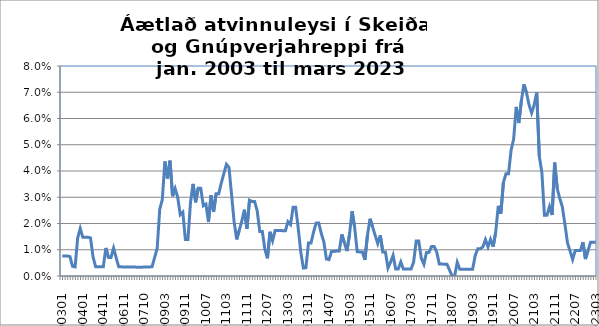
| Category | Series 0 |
|---|---|
| 200301 | 0.008 |
| 200302 | 0.008 |
| 200303 | 0.008 |
| 200304 | 0.007 |
| 200305 | 0.004 |
| 200308 | 0.003 |
| 200311 | 0.014 |
| 200312 | 0.018 |
| 200401 | 0.015 |
| 200402 | 0.015 |
| 200403 | 0.015 |
| 200404 | 0.014 |
| 200405 | 0.007 |
| 200407 | 0.004 |
| 200409 | 0.004 |
| 200410 | 0.004 |
| 200411 | 0.004 |
| 200412 | 0.011 |
| 200501 | 0.007 |
| 200502 | 0.007 |
| 200503 | 0.011 |
| 200504 | 0.007 |
| 200505 | 0.003 |
| 200506 | 0.003 |
| 200611 | 0.003 |
| 200612 | 0.003 |
| 200701 | 0.003 |
| 200702 | 0.003 |
| 200703 | 0.003 |
| 200705 | 0.003 |
| 200706 | 0.003 |
| 200709 | 0.003 |
| 200710 | 0.003 |
| 200711 | 0.003 |
| 200712 | 0.003 |
| 200810 | 0.004 |
| 200811 | 0.007 |
| 200812 | 0.011 |
| 200901 | 0.025 |
| 200902 | 0.029 |
| 200903 | 0.044 |
| 200904 | 0.037 |
| 200905 | 0.044 |
| 200906 | 0.03 |
| 200907 | 0.033 |
| 200908 | 0.03 |
| 200909 | 0.023 |
| 200910 | 0.024 |
| 200911 | 0.014 |
| 200912 | 0.014 |
| 201001 | 0.028 |
| 201002 | 0.035 |
| 201003 | 0.028 |
| 201004 | 0.033 |
| 201005 | 0.033 |
| 201006 | 0.027 |
| 201007 | 0.027 |
| 201008 | 0.021 |
| 201009 | 0.031 |
| 201010 | 0.024 |
| 201011 | 0.031 |
| 201012 | 0.031 |
| 201101 | 0.035 |
| 201102 | 0.039 |
| 201103 | 0.043 |
| 201104 | 0.041 |
| 201105 | 0.031 |
| 201106 | 0.021 |
| 201107 | 0.014 |
| 201108 | 0.017 |
| 201109 | 0.021 |
| 201110 | 0.025 |
| 201111 | 0.018 |
| 201112 | 0.029 |
| 201201 | 0.028 |
| 201202 | 0.028 |
| 201203 | 0.025 |
| 201204 | 0.017 |
| 201205 | 0.017 |
| 201206 | 0.01 |
| 201207 | 0.007 |
| 201208 | 0.017 |
| 201209 | 0.013 |
| 201210 | 0.017 |
| 201211 | 0.017 |
| 201212 | 0.017 |
| 201301 | 0.017 |
| 201302 | 0.017 |
| 201303 | 0.021 |
| 201304 | 0.02 |
| 201305 | 0.026 |
| 201306 | 0.026 |
| 201307 | 0.018 |
| 201308 | 0.009 |
| 201309 | 0.003 |
| 201310 | 0.003 |
| 201311 | 0.013 |
| 201312 | 0.013 |
| 201401 | 0.017 |
| 201402 | 0.02 |
| 201403 | 0.02 |
| 201404 | 0.016 |
| 201405 | 0.013 |
| 201406 | 0.006 |
| 201407 | 0.006 |
| 201408 | 0.009 |
| 201409 | 0.009 |
| 201410 | 0.01 |
| 201411 | 0.01 |
| 201412 | 0.016 |
| 2001501 | 0.013 |
| 201502 | 0.009 |
| 201503 | 0.016 |
| 201504 | 0.025 |
| 201505 | 0.019 |
| 201506 | 0.009 |
| 201507 | 0.009 |
| 201508 | 0.009 |
| 201509 | 0.006 |
| 201510 | 0.016 |
| 201511 | 0.022 |
| 201512 | 0.019 |
| 201601 | 0.015 |
| 201602 | 0.012 |
| 201603 | 0.015 |
| 201604 | 0.009 |
| 201605 | 0.009 |
| 201606 | 0.003 |
| 201607 | 0.005 |
| 201608 | 0.008 |
| 201609 | 0.003 |
| 201610 | 0.003 |
| 201611 | 0.005 |
| 201612 | 0.003 |
| 201701 | 0.003 |
| 201702 | 0.003 |
| 201703 | 0.003 |
| 201704 | 0.005 |
| 201705 | 0.013 |
| 201706 | 0.013 |
| 201707 | 0.007 |
| 201708 | 0.004 |
| 201709 | 0.009 |
| 201710 | 0.009 |
| 201711 | 0.011 |
| 201712 | 0.011 |
| 201801 | 0.009 |
| 201802 | 0.005 |
| 201803 | 0.005 |
| 201804 | 0.004 |
| 201805 | 0.004 |
| 201806 | 0.002 |
| 201807 | 0 |
| 201808 | 0 |
| 201809 | 0.005 |
| 201810 | 0.003 |
| 201811 | 0.003 |
| 201812 | 0.003 |
| 201901 | 0.003 |
| 201902 | 0.003 |
| 201903 | 0.003 |
| 201904 | 0.008 |
| 201905 | 0.01 |
| 201906 | 0.01 |
| 201907 | 0.011 |
| 201908 | 0.014 |
| 201909 | 0.011 |
| 201910 | 0.014 |
| 201911 | 0.011 |
| 201912 | 0.017 |
| 202001 | 0.027 |
| 202002 | 0.024 |
| 202003 | 0.036 |
| 202004 | 0.039 |
| 202005 | 0.039 |
| 202006 | 0.048 |
| 202007 | 0.052 |
| 202008 | 0.064 |
| 202009 | 0.058 |
| 202010 | 0.067 |
| 202011 | 0.073 |
| 202012 | 0.07 |
| 202101 | 0.065 |
| 202102 | 0.062 |
| 202103 | 0.065 |
| 202104 | 0.07 |
| 202105 | 0.046 |
| 202106 | 0.04 |
| 202107 | 0.023 |
| 202108 | 0.023 |
| 202109 | 0.026 |
| 202110 | 0.023 |
| 202111 | 0.043 |
| 202112 | 0.033 |
| 202201 | 0.03 |
| 202202 | 0.026 |
| 202203 | 0.02 |
| 202204 | 0.013 |
| 202205 | 0.009 |
| 202206 | 0.006 |
| 202207 | 0.01 |
| 202208 | 0.01 |
| 202209 | 0.01 |
| 202210 | 0.013 |
| 202211 | 0.006 |
| 202212 | 0.01 |
| 202301 | 0.013 |
| 202302 | 0.013 |
| 202303 | 0.013 |